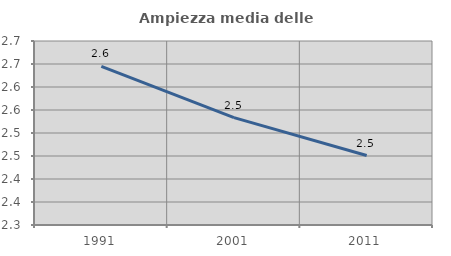
| Category | Ampiezza media delle famiglie |
|---|---|
| 1991.0 | 2.645 |
| 2001.0 | 2.533 |
| 2011.0 | 2.451 |